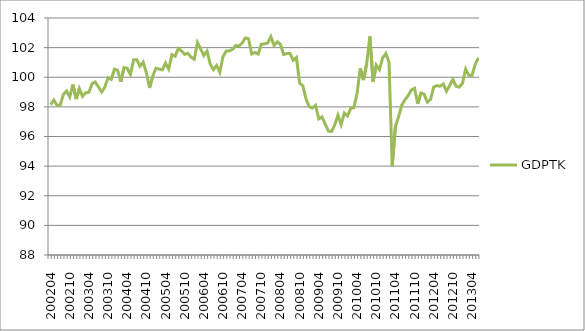
| Category | GDPTK |
|---|---|
| 200204.0 | 98.142 |
| 200205.0 | 98.462 |
| 200206.0 | 98.101 |
| 200207.0 | 98.122 |
| 200208.0 | 98.837 |
| 200209.0 | 99.072 |
| 200210.0 | 98.672 |
| 200211.0 | 99.504 |
| 200212.0 | 98.526 |
| 200301.0 | 99.234 |
| 200302.0 | 98.71 |
| 200303.0 | 98.952 |
| 200304.0 | 98.987 |
| 200305.0 | 99.567 |
| 200306.0 | 99.674 |
| 200307.0 | 99.343 |
| 200308.0 | 99.003 |
| 200309.0 | 99.339 |
| 200310.0 | 99.972 |
| 200311.0 | 99.852 |
| 200312.0 | 100.546 |
| 200401.0 | 100.468 |
| 200402.0 | 99.69 |
| 200403.0 | 100.656 |
| 200404.0 | 100.598 |
| 200405.0 | 100.187 |
| 200406.0 | 101.184 |
| 200407.0 | 101.189 |
| 200408.0 | 100.739 |
| 200409.0 | 101.018 |
| 200410.0 | 100.295 |
| 200411.0 | 99.281 |
| 200412.0 | 100.065 |
| 200501.0 | 100.606 |
| 200502.0 | 100.55 |
| 200503.0 | 100.497 |
| 200504.0 | 100.96 |
| 200505.0 | 100.553 |
| 200506.0 | 101.529 |
| 200507.0 | 101.422 |
| 200508.0 | 101.951 |
| 200509.0 | 101.774 |
| 200510.0 | 101.545 |
| 200511.0 | 101.618 |
| 200512.0 | 101.358 |
| 200601.0 | 101.221 |
| 200602.0 | 102.341 |
| 200603.0 | 101.911 |
| 200604.0 | 101.47 |
| 200605.0 | 101.768 |
| 200606.0 | 100.882 |
| 200607.0 | 100.515 |
| 200608.0 | 100.793 |
| 200609.0 | 100.336 |
| 200610.0 | 101.395 |
| 200611.0 | 101.766 |
| 200612.0 | 101.771 |
| 200701.0 | 101.886 |
| 200702.0 | 102.137 |
| 200703.0 | 102.107 |
| 200704.0 | 102.307 |
| 200705.0 | 102.658 |
| 200706.0 | 102.593 |
| 200707.0 | 101.574 |
| 200708.0 | 101.67 |
| 200709.0 | 101.568 |
| 200710.0 | 102.225 |
| 200711.0 | 102.253 |
| 200712.0 | 102.314 |
| 200801.0 | 102.74 |
| 200802.0 | 102.156 |
| 200803.0 | 102.39 |
| 200804.0 | 102.223 |
| 200805.0 | 101.537 |
| 200806.0 | 101.602 |
| 200807.0 | 101.606 |
| 200808.0 | 101.14 |
| 200809.0 | 101.337 |
| 200810.0 | 99.605 |
| 200811.0 | 99.429 |
| 200812.0 | 98.537 |
| 200901.0 | 98.022 |
| 200902.0 | 97.92 |
| 200903.0 | 98.104 |
| 200904.0 | 97.193 |
| 200905.0 | 97.32 |
| 200906.0 | 96.841 |
| 200907.0 | 96.37 |
| 200908.0 | 96.337 |
| 200909.0 | 96.776 |
| 200910.0 | 97.428 |
| 200911.0 | 96.808 |
| 200912.0 | 97.587 |
| 201001.0 | 97.39 |
| 201002.0 | 97.889 |
| 201003.0 | 97.952 |
| 201004.0 | 98.914 |
| 201005.0 | 100.61 |
| 201006.0 | 99.812 |
| 201007.0 | 100.894 |
| 201008.0 | 102.759 |
| 201009.0 | 99.703 |
| 201010.0 | 100.812 |
| 201011.0 | 100.511 |
| 201012.0 | 101.302 |
| 201101.0 | 101.592 |
| 201102.0 | 101.024 |
| 201103.0 | 94.01 |
| 201104.0 | 96.666 |
| 201105.0 | 97.339 |
| 201106.0 | 98.115 |
| 201107.0 | 98.479 |
| 201108.0 | 98.765 |
| 201109.0 | 99.139 |
| 201110.0 | 99.256 |
| 201111.0 | 98.204 |
| 201112.0 | 98.936 |
| 201201.0 | 98.861 |
| 201202.0 | 98.322 |
| 201203.0 | 98.502 |
| 201204.0 | 99.347 |
| 201205.0 | 99.434 |
| 201206.0 | 99.39 |
| 201207.0 | 99.552 |
| 201208.0 | 99.054 |
| 201209.0 | 99.45 |
| 201210.0 | 99.863 |
| 201211.0 | 99.397 |
| 201212.0 | 99.334 |
| 201301.0 | 99.588 |
| 201302.0 | 100.551 |
| 201303.0 | 100.131 |
| 201304.0 | 100.124 |
| 201305.0 | 100.871 |
| 201306.0 | 101.321 |